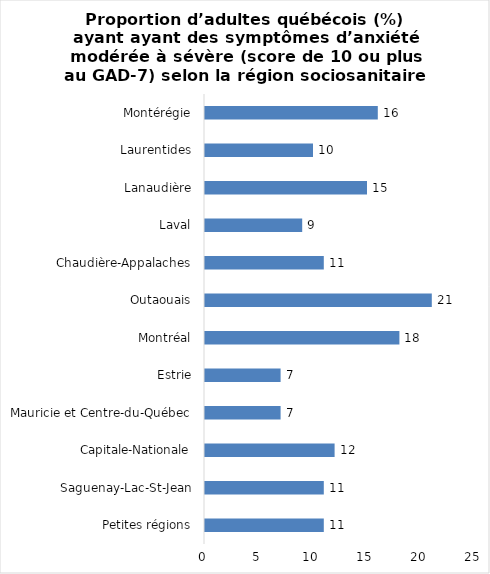
| Category | Series 0 |
|---|---|
| Petites régions | 11 |
| Saguenay-Lac-St-Jean | 11 |
| Capitale-Nationale | 12 |
| Mauricie et Centre-du-Québec | 7 |
| Estrie | 7 |
| Montréal | 18 |
| Outaouais | 21 |
| Chaudière-Appalaches | 11 |
| Laval | 9 |
| Lanaudière | 15 |
| Laurentides | 10 |
| Montérégie | 16 |